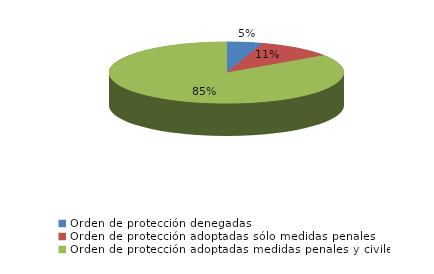
| Category | Series 0 |
|---|---|
| Orden de protección denegadas | 21 |
| Orden de protección adoptadas sólo medidas penales | 45 |
| Orden de protección adoptadas medidas penales y civiles | 361 |